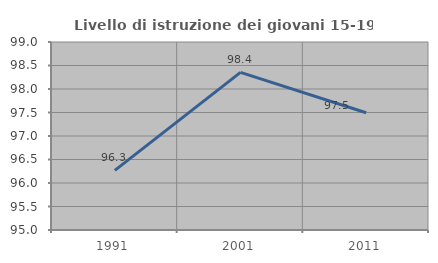
| Category | Livello di istruzione dei giovani 15-19 anni |
|---|---|
| 1991.0 | 96.267 |
| 2001.0 | 98.353 |
| 2011.0 | 97.494 |